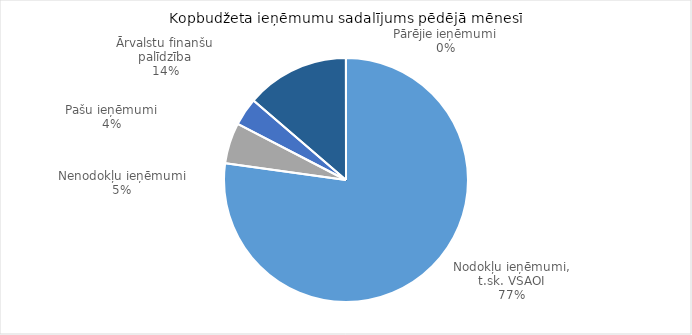
| Category | Series 0 |
|---|---|
| Nodokļu ieņēmumi, t.sk. VSAOI | 957835.152 |
| Nenodokļu ieņēmumi | 67048.771 |
| Pašu ieņēmumi | 45819.083 |
| Ārvalstu finanšu palīdzība | 169923.774 |
| Pārējie ieņēmumi | -146.486 |